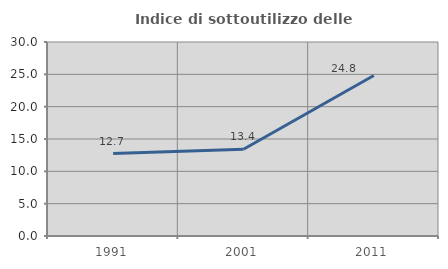
| Category | Indice di sottoutilizzo delle abitazioni  |
|---|---|
| 1991.0 | 12.741 |
| 2001.0 | 13.421 |
| 2011.0 | 24.822 |